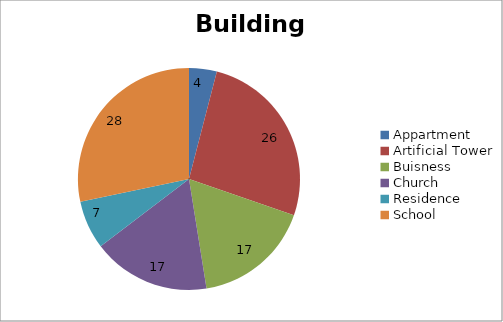
| Category | Building Type |
|---|---|
| Appartment | 4 |
| Artificial Tower | 26 |
| Buisness | 17 |
| Church | 17 |
| Residence | 7 |
| School | 28 |